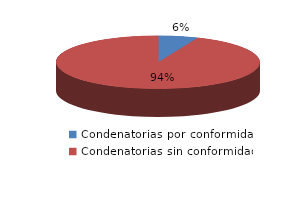
| Category | Series 0 |
|---|---|
| 0 | 6 |
| 1 | 89 |